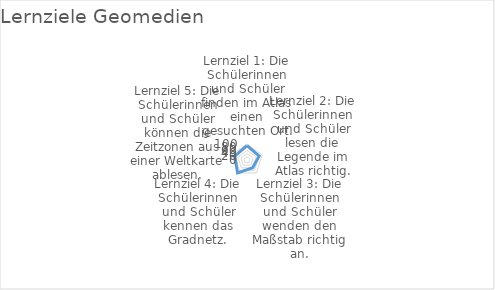
| Category | Series 0 |
|---|---|
| Lernziel 1: Die Schülerinnen und Schüler finden im Atlas einen gesuchten Ort. | 90 |
| Lernziel 2: Die Schülerinnen und Schüler lesen die Legende im Atlas richtig. | 80 |
| Lernziel 3: Die Schülerinnen und Schüler wenden den Maßstab richtig an. | 60 |
| Lernziel 4: Die Schülerinnen und Schüler kennen das Gradnetz. | 100 |
| Lernziel 5: Die Schülerinnen und Schüler können die Zeitzonen aus einer Weltkarte ablesen. | 80 |